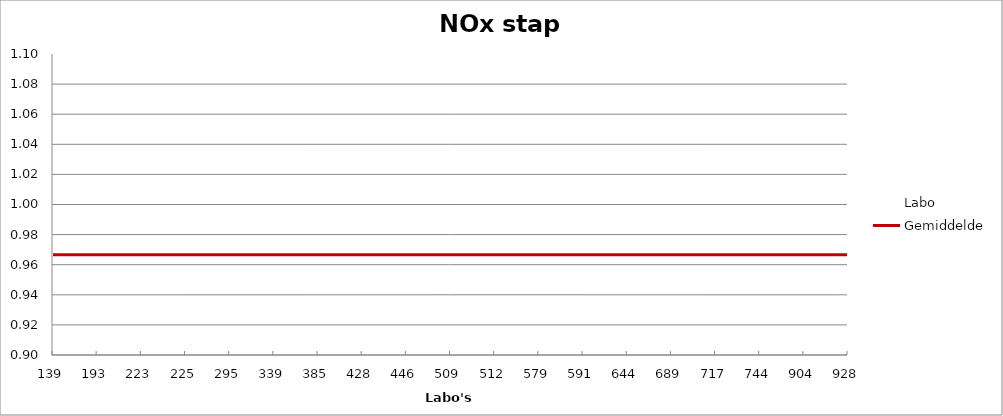
| Category | Labo | Gemiddelde |
|---|---|---|
| 139.0 | 0.946 | 0.967 |
| 193.0 | 0.953 | 0.967 |
| 223.0 | 0.985 | 0.967 |
| 225.0 | 0.977 | 0.967 |
| 295.0 | 0.985 | 0.967 |
| 339.0 | 0.977 | 0.967 |
| 385.0 | 0.946 | 0.967 |
| 428.0 | 1.047 | 0.967 |
| 446.0 | 0.953 | 0.967 |
| 509.0 | 0.946 | 0.967 |
| 512.0 | 1 | 0.967 |
| 579.0 | 1 | 0.967 |
| 591.0 | 0.961 | 0.967 |
| 644.0 | 1.016 | 0.967 |
| 689.0 | 0.938 | 0.967 |
| 717.0 | 0.93 | 0.967 |
| 744.0 | 0.953 | 0.967 |
| 904.0 | 0.961 | 0.967 |
| 928.0 | 0.938 | 0.967 |